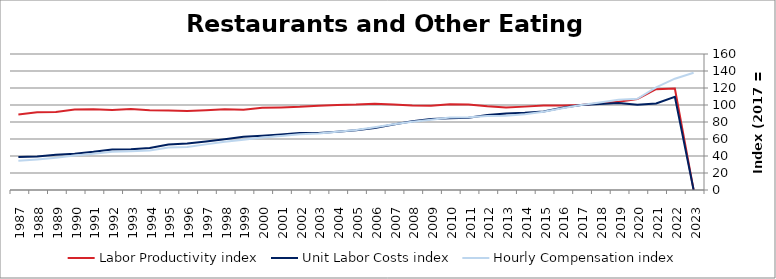
| Category | Labor Productivity index | Unit Labor Costs index | Hourly Compensation index |
|---|---|---|---|
| 2023.0 | 0 | 0 | 137.86 |
| 2022.0 | 119.412 | 109.679 | 130.97 |
| 2021.0 | 118.651 | 101.756 | 120.734 |
| 2020.0 | 106.955 | 100.3 | 107.275 |
| 2019.0 | 103.724 | 102.26 | 106.068 |
| 2018.0 | 101.949 | 101.045 | 103.014 |
| 2017.0 | 100 | 100 | 100 |
| 2016.0 | 99.482 | 96.768 | 96.267 |
| 2015.0 | 99.465 | 92.462 | 91.967 |
| 2014.0 | 98.088 | 90.748 | 89.013 |
| 2013.0 | 97.108 | 89.923 | 87.322 |
| 2012.0 | 98.396 | 88.357 | 86.939 |
| 2011.0 | 100.705 | 85.047 | 85.646 |
| 2010.0 | 100.941 | 84.43 | 85.224 |
| 2009.0 | 99.091 | 83.45 | 82.692 |
| 2008.0 | 99.278 | 80.876 | 80.292 |
| 2007.0 | 100.542 | 77.041 | 77.458 |
| 2006.0 | 101.423 | 72.91 | 73.948 |
| 2005.0 | 100.501 | 70.286 | 70.638 |
| 2004.0 | 100.119 | 68.539 | 68.621 |
| 2003.0 | 99.167 | 67.081 | 66.522 |
| 2002.0 | 97.889 | 67.116 | 65.699 |
| 2001.0 | 97.104 | 65.438 | 63.542 |
| 2000.0 | 96.741 | 63.852 | 61.77 |
| 1999.0 | 94.515 | 62.605 | 59.171 |
| 1998.0 | 94.996 | 59.832 | 56.838 |
| 1997.0 | 93.96 | 57.117 | 53.667 |
| 1996.0 | 92.823 | 54.637 | 50.715 |
| 1995.0 | 93.505 | 53.419 | 49.949 |
| 1994.0 | 93.968 | 49.533 | 46.545 |
| 1993.0 | 95.214 | 47.952 | 45.657 |
| 1992.0 | 94.033 | 47.726 | 44.878 |
| 1991.0 | 95.011 | 44.869 | 42.63 |
| 1990.0 | 94.829 | 42.702 | 40.494 |
| 1989.0 | 91.729 | 41.329 | 37.911 |
| 1988.0 | 91.396 | 39.402 | 36.012 |
| 1987.0 | 88.876 | 38.752 | 34.441 |